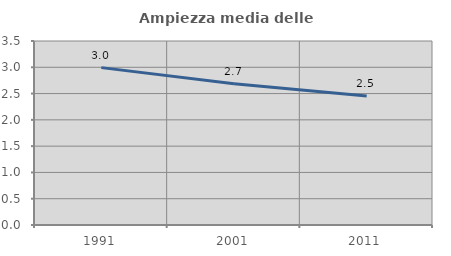
| Category | Ampiezza media delle famiglie |
|---|---|
| 1991.0 | 2.994 |
| 2001.0 | 2.685 |
| 2011.0 | 2.452 |